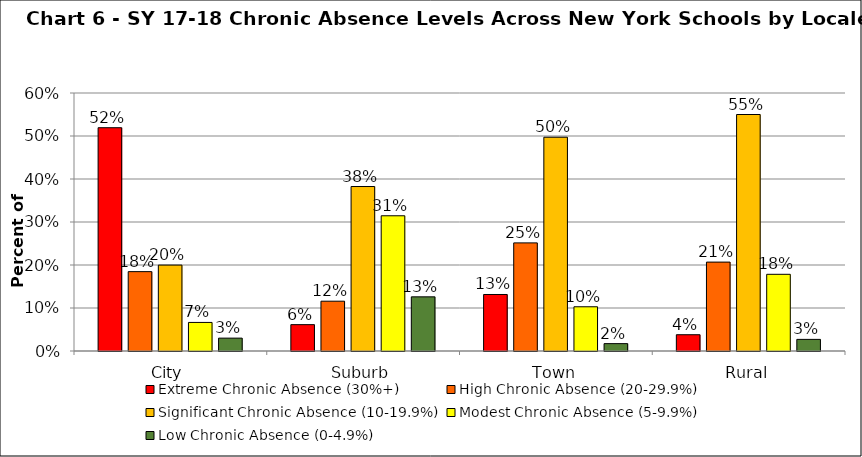
| Category | Extreme Chronic Absence (30%+) | High Chronic Absence (20-29.9%) | Significant Chronic Absence (10-19.9%) | Modest Chronic Absence (5-9.9%) | Low Chronic Absence (0-4.9%) |
|---|---|---|---|---|---|
| 0 | 0.519 | 0.185 | 0.2 | 0.066 | 0.03 |
| 1 | 0.061 | 0.116 | 0.382 | 0.314 | 0.126 |
| 2 | 0.131 | 0.251 | 0.497 | 0.103 | 0.017 |
| 3 | 0.038 | 0.207 | 0.55 | 0.178 | 0.027 |